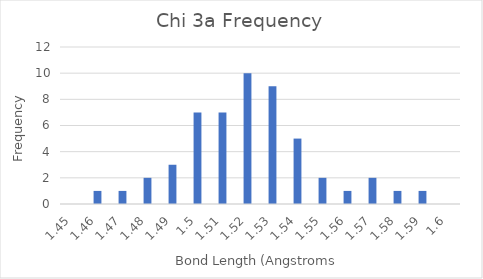
| Category | Chi 3a |
|---|---|
| 1.45 | 0 |
| 1.46 | 1 |
| 1.47 | 1 |
| 1.48 | 2 |
| 1.49 | 3 |
| 1.5 | 7 |
| 1.51 | 7 |
| 1.52 | 10 |
| 1.53 | 9 |
| 1.54 | 5 |
| 1.55 | 2 |
| 1.56 | 1 |
| 1.57 | 2 |
| 1.58 | 1 |
| 1.59 | 1 |
| 1.6 | 0 |